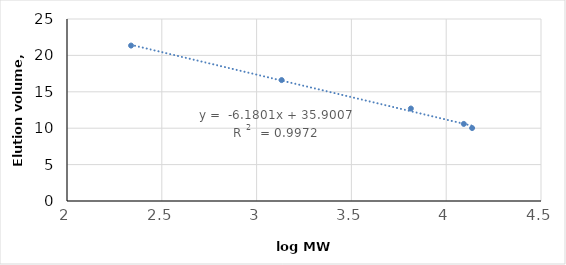
| Category | Series 0 |
|---|---|
| 2.3378584290410944 | 21.35 |
| 3.1320578686592913 | 16.61 |
| 3.813714391881145 | 12.7 |
| 4.092860943338818 | 10.59 |
| 4.136720567156407 | 10.02 |